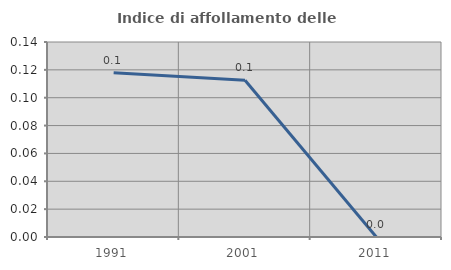
| Category | Indice di affollamento delle abitazioni  |
|---|---|
| 1991.0 | 0.118 |
| 2001.0 | 0.112 |
| 2011.0 | 0 |